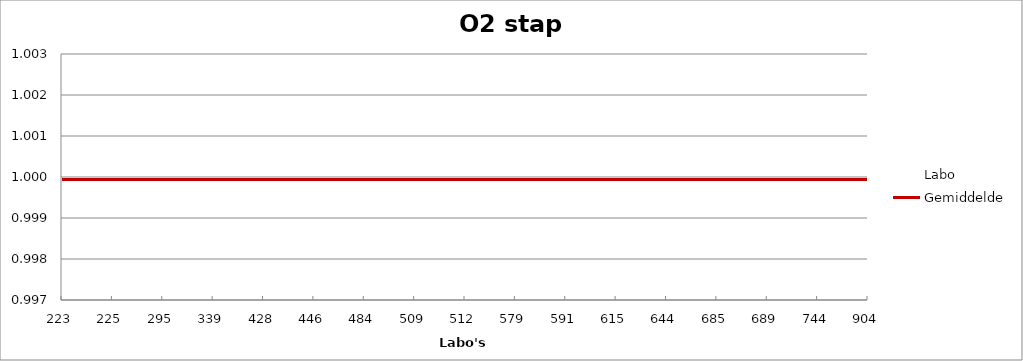
| Category | Labo | Gemiddelde |
|---|---|---|
| 223.0 | 1.001 | 1 |
| 225.0 | 1 | 1 |
| 295.0 | 1 | 1 |
| 339.0 | 1 | 1 |
| 428.0 | 1 | 1 |
| 446.0 | 1 | 1 |
| 484.0 | 1.001 | 1 |
| 509.0 | 1 | 1 |
| 512.0 | 1 | 1 |
| 579.0 | 1 | 1 |
| 591.0 | 1 | 1 |
| 615.0 | 0.999 | 1 |
| 644.0 | 1 | 1 |
| 685.0 | 0.999 | 1 |
| 689.0 | 1 | 1 |
| 744.0 | 1 | 1 |
| 904.0 | 0.999 | 1 |